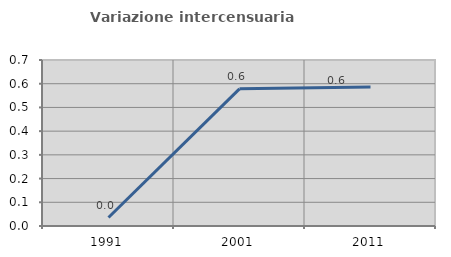
| Category | Variazione intercensuaria annua |
|---|---|
| 1991.0 | 0.036 |
| 2001.0 | 0.578 |
| 2011.0 | 0.586 |